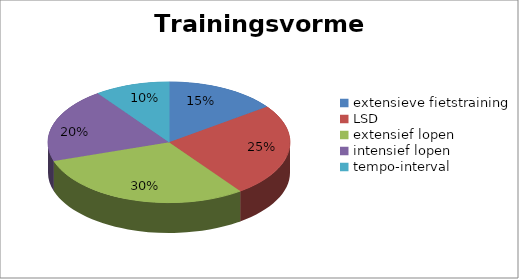
| Category | Series 0 |
|---|---|
| extensieve fietstraining | 45 |
| LSD | 75 |
| extensief lopen | 90 |
| intensief lopen | 60 |
| tempo-interval | 30 |